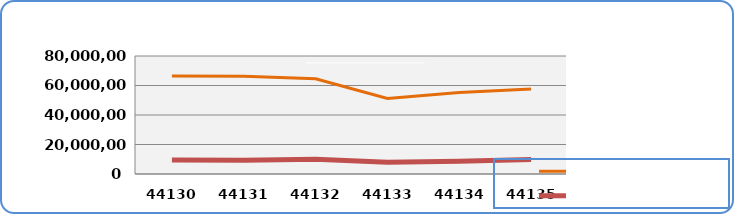
| Category | Motorin Türleri | Benzin Türleri |
|---|---|---|
| 10/26/20 | 66381382.611 | 9425412.88 |
| 10/27/20 | 66336739.425 | 9373828.249 |
| 10/28/20 | 64575613.454 | 9962603.118 |
| 10/29/20 | 51145986.456 | 7966843.715 |
| 10/30/20 | 55285806.634 | 8653652.609 |
| 10/31/20 | 57572102.309 | 9775012.969 |